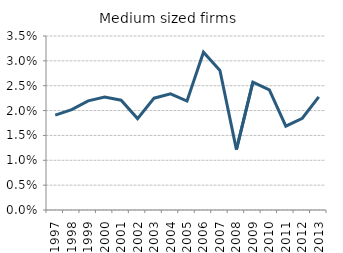
| Category | Series 0 |
|---|---|
| 1997.0 | 0.019 |
| 1998.0 | 0.02 |
| 1999.0 | 0.022 |
| 2000.0 | 0.023 |
| 2001.0 | 0.022 |
| 2002.0 | 0.018 |
| 2003.0 | 0.022 |
| 2004.0 | 0.023 |
| 2005.0 | 0.022 |
| 2006.0 | 0.032 |
| 2007.0 | 0.028 |
| 2008.0 | 0.012 |
| 2009.0 | 0.026 |
| 2010.0 | 0.024 |
| 2011.0 | 0.017 |
| 2012.0 | 0.018 |
| 2013.0 | 0.023 |